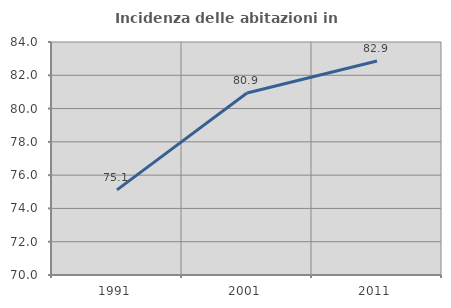
| Category | Incidenza delle abitazioni in proprietà  |
|---|---|
| 1991.0 | 75.115 |
| 2001.0 | 80.935 |
| 2011.0 | 82.857 |